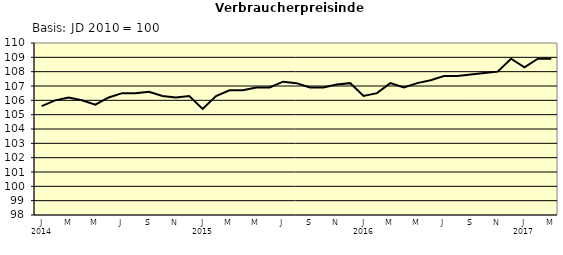
| Category | Series 0 |
|---|---|
| 0 | 105.6 |
| 1 | 106 |
| 2 | 106.2 |
| 3 | 106 |
| 4 | 105.7 |
| 5 | 106.2 |
| 6 | 106.5 |
| 7 | 106.5 |
| 8 | 106.6 |
| 9 | 106.3 |
| 10 | 106.2 |
| 11 | 106.3 |
| 12 | 105.4 |
| 13 | 106.3 |
| 14 | 106.7 |
| 15 | 106.7 |
| 16 | 106.9 |
| 17 | 106.9 |
| 18 | 107.3 |
| 19 | 107.2 |
| 20 | 106.9 |
| 21 | 106.9 |
| 22 | 107.1 |
| 23 | 107.2 |
| 24 | 106.3 |
| 25 | 106.5 |
| 26 | 107.2 |
| 27 | 106.9 |
| 28 | 107.2 |
| 29 | 107.4 |
| 30 | 107.7 |
| 31 | 107.7 |
| 32 | 107.8 |
| 33 | 107.9 |
| 34 | 108 |
| 35 | 108.9 |
| 36 | 108.3 |
| 37 | 108.9 |
| 38 | 108.9 |